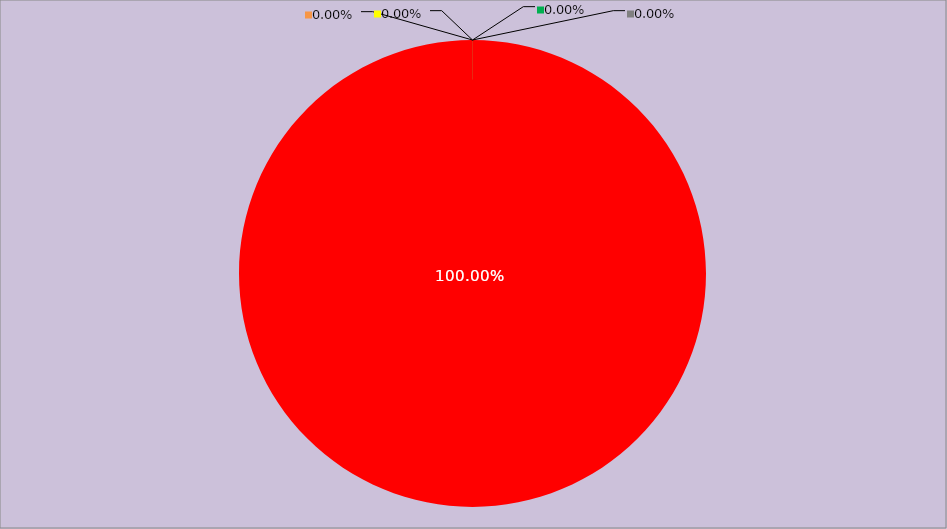
| Category | Année 2029 |
|---|---|
| Mesures non appliquées | 168 |
| Mesures appliquées mais peu ou pas documentées | 0 |
| Mesures appliquées et documentées | 0 |
| Mesures appliquées, documentées et contrôlées | 0 |
| Mesures non applicables | 0 |